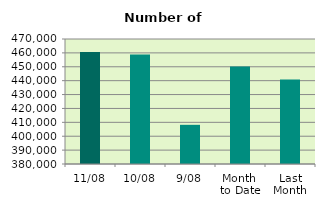
| Category | Series 0 |
|---|---|
| 11/08 | 460666 |
| 10/08 | 458796 |
| 9/08 | 408208 |
| Month 
to Date | 450251.333 |
| Last
Month | 440756.667 |